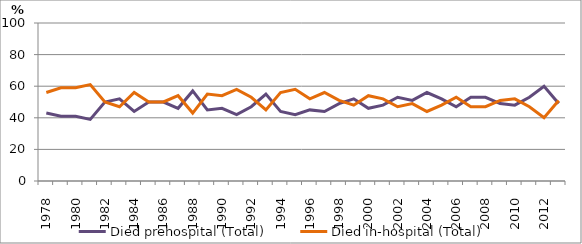
| Category | Died prehospital (Total) | Died in-hospital (Total) |
|---|---|---|
| 1978.0 | 43 | 56 |
| 1979.0 | 41 | 59 |
| 1980.0 | 41 | 59 |
| 1981.0 | 39 | 61 |
| 1982.0 | 50 | 50 |
| 1983.0 | 52 | 47 |
| 1984.0 | 44 | 56 |
| 1985.0 | 50 | 50 |
| 1986.0 | 50 | 50 |
| 1987.0 | 46 | 54 |
| 1988.0 | 57 | 43 |
| 1989.0 | 45 | 55 |
| 1990.0 | 46 | 54 |
| 1991.0 | 42 | 58 |
| 1992.0 | 47 | 53 |
| 1993.0 | 55 | 45 |
| 1994.0 | 44 | 56 |
| 1995.0 | 42 | 58 |
| 1996.0 | 45 | 52 |
| 1997.0 | 44 | 56 |
| 1998.0 | 49 | 51 |
| 1999.0 | 52 | 48 |
| 2000.0 | 46 | 54 |
| 2001.0 | 48 | 52 |
| 2002.0 | 53 | 47 |
| 2003.0 | 51 | 49 |
| 2004.0 | 56 | 44 |
| 2005.0 | 52 | 48 |
| 2006.0 | 47 | 53 |
| 2007.0 | 53 | 47 |
| 2008.0 | 53 | 47 |
| 2009.0 | 49 | 51 |
| 2010.0 | 48 | 52 |
| 2011.0 | 53 | 47 |
| 2012.0 | 60 | 40 |
| 2013.0 | 49 | 51 |